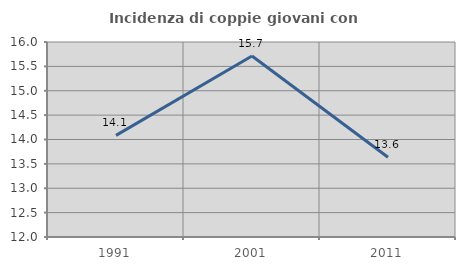
| Category | Incidenza di coppie giovani con figli |
|---|---|
| 1991.0 | 14.085 |
| 2001.0 | 15.714 |
| 2011.0 | 13.636 |